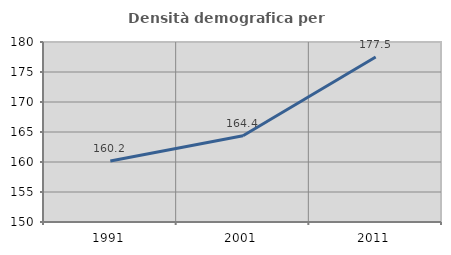
| Category | Densità demografica |
|---|---|
| 1991.0 | 160.157 |
| 2001.0 | 164.37 |
| 2011.0 | 177.494 |